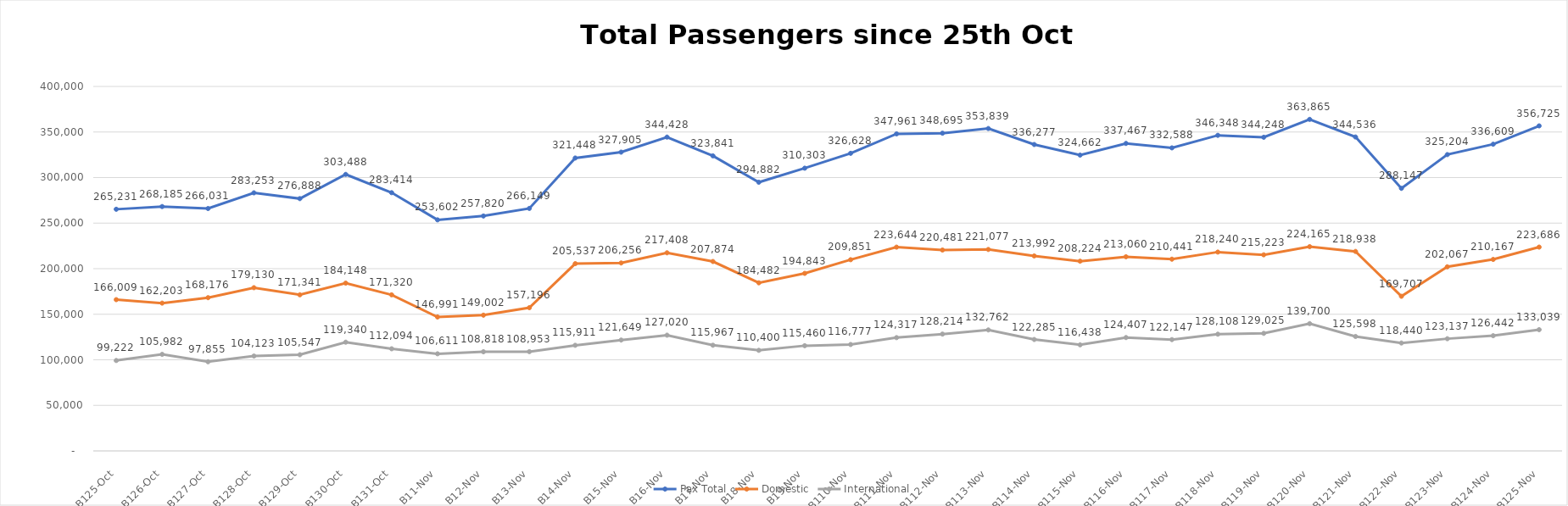
| Category | Pax Total |  Domestic  |  International  |
|---|---|---|---|
| 2022-10-25 | 265231 | 166009 | 99222 |
| 2022-10-26 | 268185 | 162203 | 105982 |
| 2022-10-27 | 266031 | 168176 | 97855 |
| 2022-10-28 | 283253 | 179130 | 104123 |
| 2022-10-29 | 276888 | 171341 | 105547 |
| 2022-10-30 | 303488 | 184148 | 119340 |
| 2022-10-31 | 283414 | 171320 | 112094 |
| 2022-11-01 | 253602 | 146991 | 106611 |
| 2022-11-02 | 257820 | 149002 | 108818 |
| 2022-11-03 | 266149 | 157196 | 108953 |
| 2022-11-04 | 321448 | 205537 | 115911 |
| 2022-11-05 | 327905 | 206256 | 121649 |
| 2022-11-06 | 344428 | 217408 | 127020 |
| 2022-11-07 | 323841 | 207874 | 115967 |
| 2022-11-08 | 294882 | 184482 | 110400 |
| 2022-11-09 | 310303 | 194843 | 115460 |
| 2022-11-10 | 326628 | 209851 | 116777 |
| 2022-11-11 | 347961 | 223644 | 124317 |
| 2022-11-12 | 348695 | 220481 | 128214 |
| 2022-11-13 | 353839 | 221077 | 132762 |
| 2022-11-14 | 336277 | 213992 | 122285 |
| 2022-11-15 | 324662 | 208224 | 116438 |
| 2022-11-16 | 337467 | 213060 | 124407 |
| 2022-11-17 | 332588 | 210441 | 122147 |
| 2022-11-18 | 346348 | 218240 | 128108 |
| 2022-11-19 | 344248 | 215223 | 129025 |
| 2022-11-20 | 363865 | 224165 | 139700 |
| 2022-11-21 | 344536 | 218938 | 125598 |
| 2022-11-22 | 288147 | 169707 | 118440 |
| 2022-11-23 | 325204 | 202067 | 123137 |
| 2022-11-24 | 336609 | 210167 | 126442 |
| 2022-11-25 | 356725 | 223686 | 133039 |